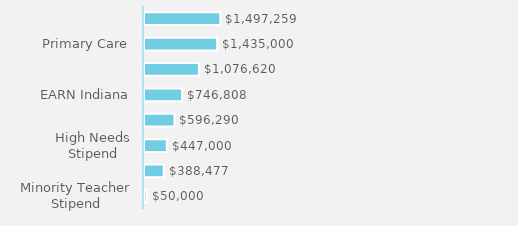
| Category | Series 0 |
|---|---|
| Minority Teacher Stipend | 49999.84 |
| Minority Teacher Scholarship | 388477 |
| High Needs Stipend | 447000 |
| Workforce Ready Grant | 596290.15 |
| EARN Indiana | 746808.29 |
| Mitch Daniels Early Graduation | 1076619.5 |
| Primary Care | 1435000 |
| Next Generation Hoosier Educators Scholarship | 1497258.63 |